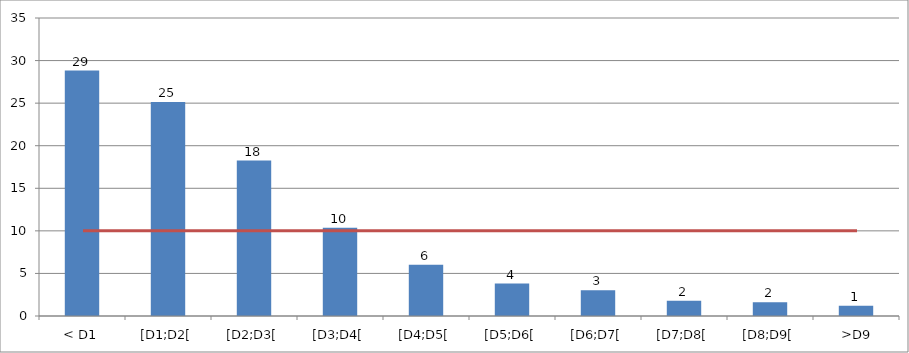
| Category | Series 0 |
|---|---|
| < D1 | 28.83 |
| [D1;D2[ | 25.12 |
| [D2;D3[ | 18.25 |
| [D3;D4[ | 10.37 |
| [D4;D5[ | 6.01 |
| [D5;D6[ | 3.81 |
| [D6;D7[ | 3.03 |
| [D7;D8[ | 1.78 |
| [D8;D9[ | 1.61 |
|  >D9 | 1.19 |